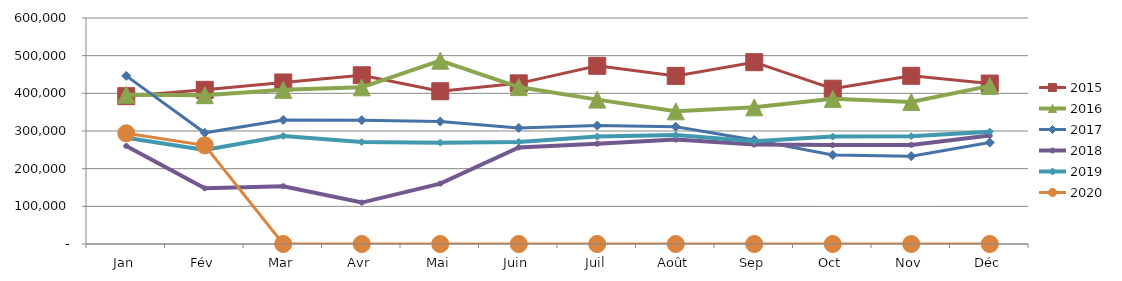
| Category | 2015 | 2016 | 2017 | 2018 | 2019 | 2020 |
|---|---|---|---|---|---|---|
| Jan | 392455.386 | 396263.914 | 446281.806 | 260114.073 | 282172.738 | 293841.353 |
| Fév | 409347.179 | 395175.975 | 295222.519 | 148036.843 | 249871.665 | 261954.608 |
| Mar | 428838.698 | 409222.091 | 329338.872 | 153395.928 | 286777.302 | 0 |
| Avr | 448014.817 | 415901.642 | 328702.589 | 109982.902 | 270782.686 | 0 |
| Mai | 405528.286 | 486763.336 | 325158.457 | 160382.707 | 269027.301 | 0 |
| Juin | 426462.87 | 416602.613 | 308100.463 | 256426.409 | 271108.83 | 0 |
| Juil | 473107.942 | 383313.72 | 314407.38 | 266269.669 | 285234.508 | 0 |
| Août | 446267.927 | 352198.565 | 311304.785 | 277231.878 | 289072.19 | 0 |
| Sep | 482677.503 | 362763.978 | 276260.727 | 263963.731 | 272549.159 | 0 |
| Oct | 412311.701 | 385353.331 | 236379.756 | 262549.621 | 285123.451 | 0 |
| Nov | 446526.169 | 377201.543 | 233251.128 | 263155.863 | 286119.242 | 0 |
| Déc | 425963.85 | 419714.854 | 269424.356 | 287963.859 | 298314.346 | 0 |